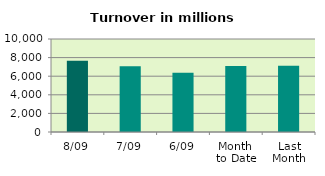
| Category | Series 0 |
|---|---|
| 8/09 | 7672.509 |
| 7/09 | 7072.029 |
| 6/09 | 6359.49 |
| Month 
to Date | 7108.349 |
| Last
Month | 7128.729 |